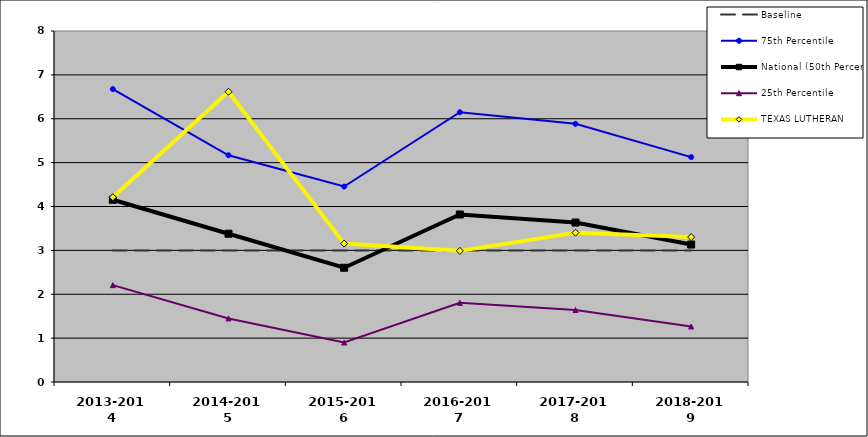
| Category | Baseline | 75th Percentile | National (50th Percentile) | 25th Percentile | TEXAS LUTHERAN |
|---|---|---|---|---|---|
| 2013-2014 | 3 | 6.677 | 4.153 | 2.207 | 4.212 |
| 2014-2015 | 3 | 5.168 | 3.379 | 1.449 | 6.615 |
| 2015-2016 | 3 | 4.455 | 2.604 | 0.9 | 3.155 |
| 2016-2017 | 3 | 6.148 | 3.818 | 1.804 | 2.989 |
| 2017-2018 | 3 | 5.884 | 3.634 | 1.641 | 3.403 |
| 2018-2019 | 3 | 5.125 | 3.133 | 1.267 | 3.303 |